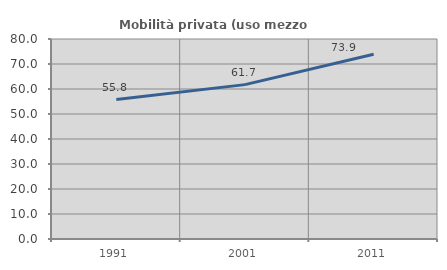
| Category | Mobilità privata (uso mezzo privato) |
|---|---|
| 1991.0 | 55.777 |
| 2001.0 | 61.746 |
| 2011.0 | 73.898 |